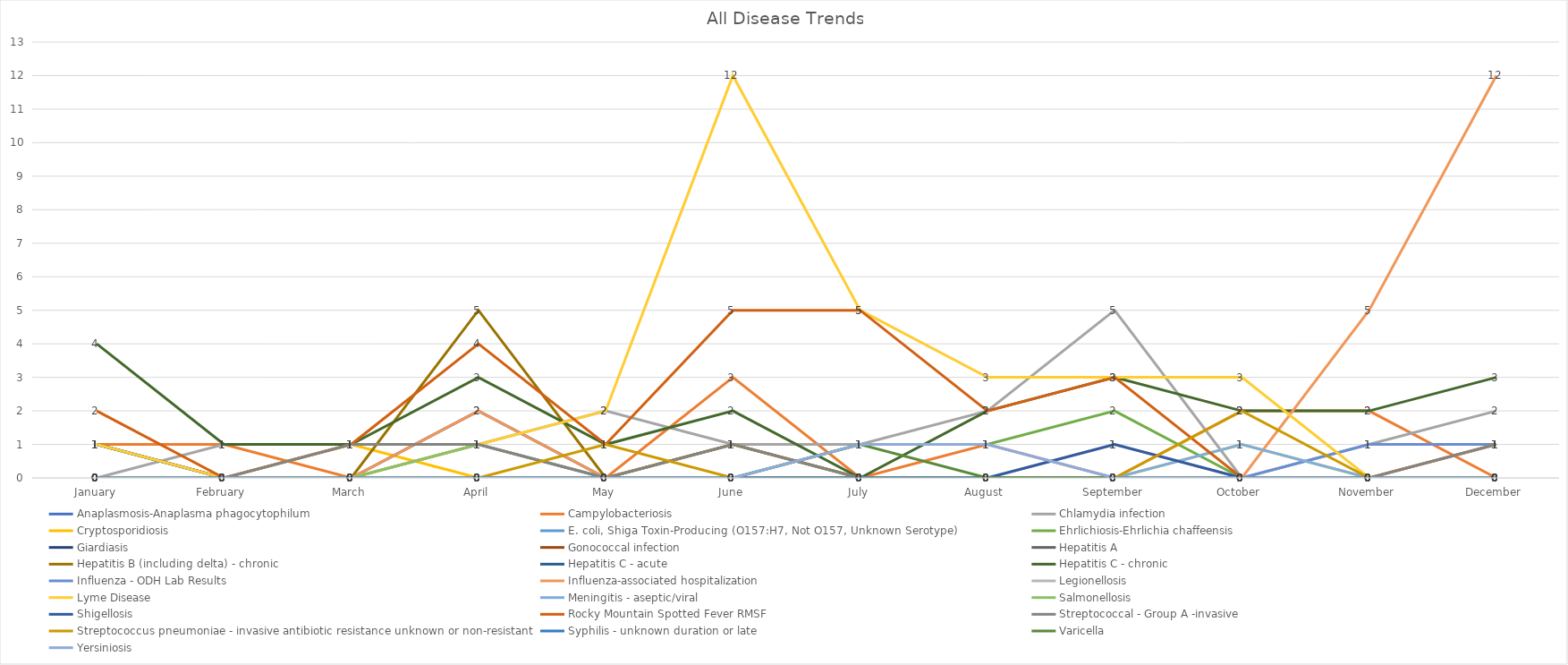
| Category | Anaplasmosis-Anaplasma phagocytophilum | Campylobacteriosis | Chlamydia infection | Cryptosporidiosis | E. coli, Shiga Toxin-Producing (O157:H7, Not O157, Unknown Serotype) | Ehrlichiosis-Ehrlichia chaffeensis | Giardiasis | Gonococcal infection | Hepatitis A | Hepatitis B (including delta) - chronic | Hepatitis C - acute | Hepatitis C - chronic | Influenza - ODH Lab Results | Influenza-associated hospitalization | Legionellosis | Lyme Disease | Meningitis - aseptic/viral | Salmonellosis | Shigellosis | Rocky Mountain Spotted Fever RMSF | Streptococcal - Group A -invasive | Streptococcus pneumoniae - invasive antibiotic resistance unknown or non-resistant | Syphilis - unknown duration or late | Varicella | Yersiniosis |
|---|---|---|---|---|---|---|---|---|---|---|---|---|---|---|---|---|---|---|---|---|---|---|---|---|---|
| January | 0 | 1 | 0 | 0 | 1 | 0 | 1 | 0 | 0 | 0 | 1 | 4 | 0 | 0 | 0 | 1 | 0 | 0 | 0 | 2 | 0 | 0 | 0 | 0 | 0 |
| February  | 0 | 1 | 1 | 0 | 0 | 0 | 0 | 0 | 0 | 0 | 0 | 1 | 0 | 0 | 0 | 0 | 0 | 0 | 0 | 0 | 0 | 0 | 0 | 0 | 0 |
| March | 0 | 0 | 1 | 1 | 0 | 0 | 0 | 0 | 0 | 0 | 0 | 1 | 0 | 0 | 0 | 0 | 0 | 0 | 0 | 1 | 1 | 0 | 0 | 0 | 0 |
| April | 0 | 0 | 1 | 0 | 0 | 0 | 2 | 0 | 1 | 5 | 0 | 3 | 0 | 2 | 0 | 1 | 0 | 1 | 0 | 4 | 1 | 0 | 0 | 0 | 0 |
| May | 0 | 0 | 2 | 0 | 0 | 0 | 0 | 0 | 0 | 0 | 0 | 1 | 0 | 0 | 0 | 2 | 0 | 0 | 0 | 1 | 0 | 1 | 0 | 0 | 0 |
| June | 1 | 3 | 1 | 1 | 0 | 0 | 0 | 0 | 0 | 1 | 0 | 2 | 0 | 0 | 0 | 12 | 0 | 0 | 0 | 5 | 1 | 0 | 0 | 0 | 0 |
| July | 0 | 0 | 1 | 0 | 0 | 1 | 0 | 0 | 0 | 0 | 0 | 0 | 0 | 0 | 0 | 5 | 0 | 0 | 0 | 5 | 0 | 0 | 0 | 1 | 1 |
| August  | 0 | 1 | 2 | 0 | 0 | 1 | 0 | 0 | 0 | 0 | 0 | 2 | 0 | 0 | 0 | 3 | 0 | 0 | 0 | 2 | 0 | 0 | 0 | 0 | 1 |
| September | 0 | 0 | 5 | 0 | 0 | 2 | 0 | 0 | 0 | 0 | 0 | 3 | 0 | 0 | 1 | 3 | 0 | 0 | 1 | 3 | 0 | 0 | 0 | 0 | 0 |
| October  | 0 | 2 | 0 | 1 | 0 | 0 | 0 | 0 | 0 | 0 | 0 | 2 | 0 | 0 | 0 | 3 | 1 | 0 | 0 | 0 | 0 | 2 | 0 | 0 | 0 |
| November | 0 | 2 | 1 | 0 | 0 | 0 | 0 | 0 | 0 | 0 | 0 | 2 | 1 | 5 | 0 | 0 | 0 | 0 | 0 | 0 | 0 | 0 | 0 | 0 | 0 |
| December | 0 | 0 | 2 | 0 | 0 | 0 | 0 | 0 | 0 | 0 | 0 | 3 | 1 | 12 | 0 | 1 | 0 | 0 | 0 | 1 | 1 | 0 | 0 | 0 | 0 |